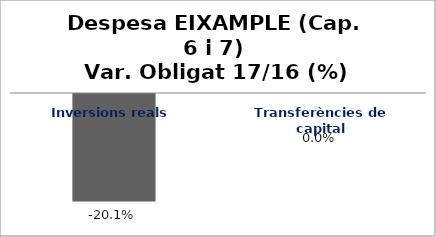
| Category | Series 0 |
|---|---|
| Inversions reals | -0.201 |
| Transferències de capital | 0 |